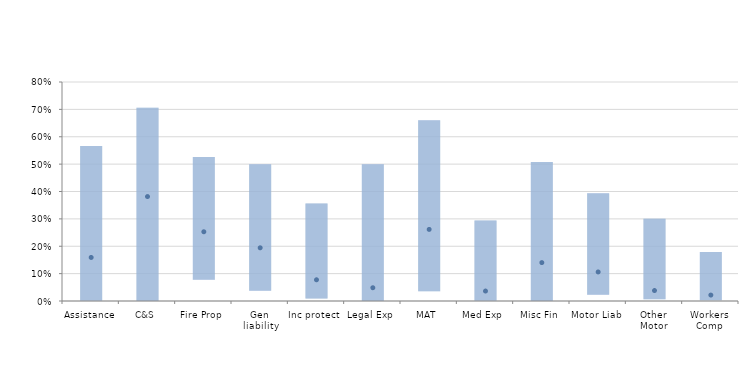
| Category | 25% | 50% | 75% |
|---|---|---|---|
| Assistance | 0.001 | 0.159 | 0.566 |
| C&S | 0 | 0.382 | 0.706 |
| Fire Prop | 0.078 | 0.253 | 0.526 |
| Gen liability | 0.037 | 0.194 | 0.499 |
| Inc protect | 0.01 | 0.078 | 0.356 |
| Legal Exp | 0 | 0.048 | 0.5 |
| MAT | 0.036 | 0.262 | 0.661 |
| Med Exp | 0.001 | 0.036 | 0.294 |
| Misc Fin | 0 | 0.14 | 0.508 |
| Motor Liab | 0.023 | 0.106 | 0.393 |
| Other Motor | 0.006 | 0.038 | 0.3 |
| Workers Comp | 0.003 | 0.022 | 0.179 |